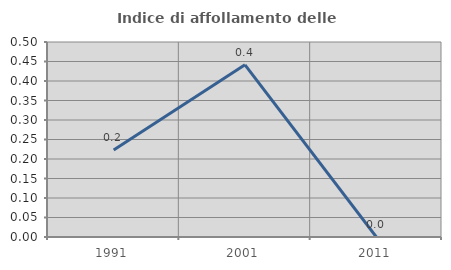
| Category | Indice di affollamento delle abitazioni  |
|---|---|
| 1991.0 | 0.223 |
| 2001.0 | 0.442 |
| 2011.0 | 0 |